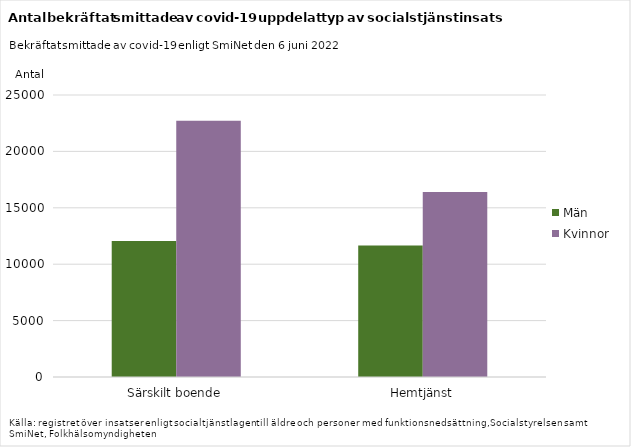
| Category | Män | Kvinnor |
|---|---|---|
| Särskilt boende | 12056 | 22712 |
| Hemtjänst | 11659 | 16390 |